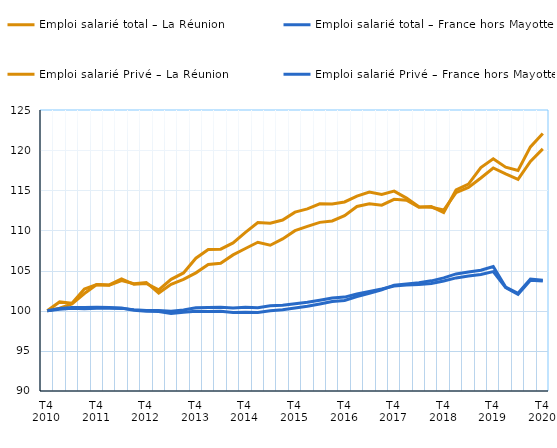
| Category | Emploi salarié total – La Réunion | Emploi salarié total – France hors Mayotte | Emploi salarié Privé – La Réunion | Emploi salarié Privé – France hors Mayotte |
|---|---|---|---|---|
| T4
2010 | 100 | 100 | 100 | 100 |
|  | 100.308 | 100.196 | 101.096 | 100.267 |
|  | 100.833 | 100.306 | 100.924 | 100.404 |
|  | 102.14 | 100.247 | 102.701 | 100.404 |
| T4
2011 | 103.275 | 100.303 | 103.256 | 100.424 |
|  | 103.209 | 100.322 | 103.168 | 100.398 |
|  | 103.951 | 100.291 | 103.76 | 100.332 |
|  | 103.291 | 100.136 | 103.36 | 100.062 |
| T4
2012 | 103.385 | 100.03 | 103.52 | 99.943 |
|  | 102.587 | 100.037 | 102.207 | 99.913 |
|  | 103.905 | 99.924 | 103.297 | 99.658 |
|  | 104.703 | 100.087 | 103.899 | 99.806 |
| T4
2013 | 106.542 | 100.367 | 104.717 | 99.945 |
|  | 107.623 | 100.411 | 105.761 | 99.898 |
|  | 107.669 | 100.443 | 105.919 | 99.934 |
|  | 108.441 | 100.33 | 106.953 | 99.764 |
| T4
2014 | 109.751 | 100.429 | 107.749 | 99.821 |
|  | 110.981 | 100.381 | 108.527 | 99.778 |
|  | 110.896 | 100.614 | 108.158 | 99.989 |
|  | 111.293 | 100.691 | 108.947 | 100.112 |
| T4
2015 | 112.28 | 100.881 | 109.973 | 100.339 |
|  | 112.687 | 101.061 | 110.501 | 100.545 |
|  | 113.319 | 101.314 | 111.003 | 100.839 |
|  | 113.298 | 101.594 | 111.185 | 101.153 |
| T4
2016 | 113.548 | 101.693 | 111.828 | 101.285 |
|  | 114.284 | 102.077 | 112.986 | 101.763 |
|  | 114.778 | 102.406 | 113.311 | 102.164 |
|  | 114.482 | 102.697 | 113.144 | 102.61 |
| T4
2017 | 114.896 | 103.081 | 113.874 | 103.179 |
|  | 114.026 | 103.19 | 113.772 | 103.33 |
|  | 112.946 | 103.255 | 112.896 | 103.499 |
|  | 112.895 | 103.396 | 112.978 | 103.721 |
| T4
2018 | 112.543 | 103.695 | 112.243 | 104.093 |
|  | 114.711 | 104.088 | 115.047 | 104.585 |
|  | 115.346 | 104.334 | 115.765 | 104.826 |
|  | 116.529 | 104.504 | 117.82 | 105.045 |
| T4
2019 | 117.775 | 104.871 | 118.929 | 105.513 |
|  | 117.036 | 102.867 | 117.871 | 102.941 |
|  | 116.354 | 102.042 | 117.477 | 102.17 |
|  | 118.598 | 103.79 | 120.401 | 103.953 |
| T4
2020 | 120.157 | 103.705 | 122.064 | 103.802 |